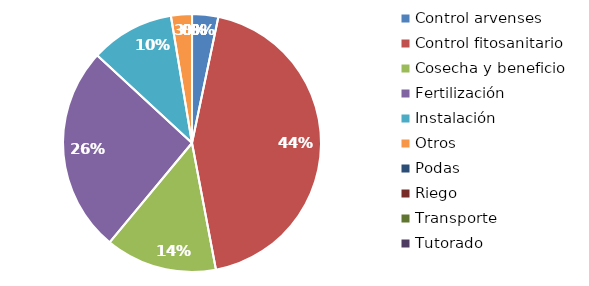
| Category | Valor |
|---|---|
| Control arvenses | 150000 |
| Control fitosanitario | 2000000 |
| Cosecha y beneficio | 640000 |
| Fertilización | 1182000 |
| Instalación | 480000 |
| Otros | 120000 |
| Podas | 0 |
| Riego | 0 |
| Transporte | 0 |
| Tutorado | 0 |